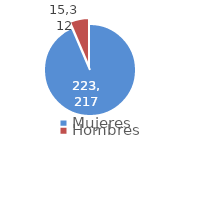
| Category | Series 0 |
|---|---|
| Mujeres | 223217 |
| Hombres | 15312 |